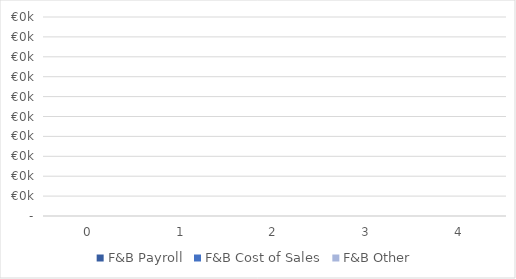
| Category | F&B Payroll | F&B Cost of Sales | F&B Other |
|---|---|---|---|
| 0.0 | 0 | 0 | 0 |
| 1.0 | 0 | 0 | 0 |
| 2.0 | 0 | 0 | 0 |
| 3.0 | 0 | 0 | 0 |
| 4.0 | 0 | 0 | 0 |